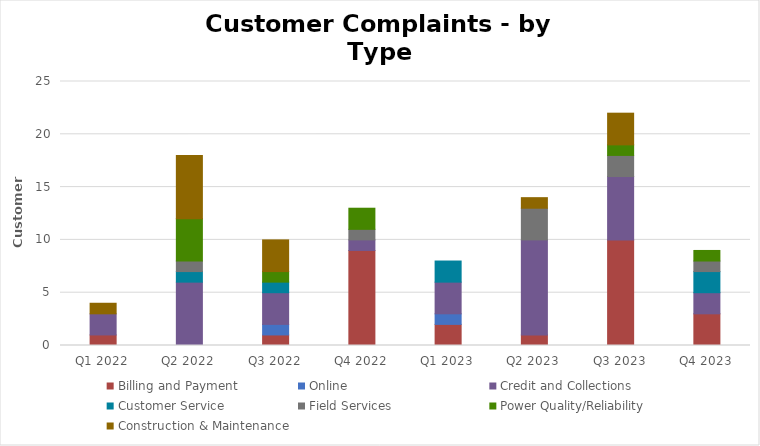
| Category | Billing and Payment | Online | Credit and Collections | Customer Service | Field Services | Power Quality/Reliability | Construction & Maintenance |
|---|---|---|---|---|---|---|---|
| Q1 2022 | 1 | 0 | 2 | 0 | 0 | 0 | 1 |
| Q2 2022 | 0 | 0 | 6 | 1 | 1 | 4 | 6 |
| Q3 2022 | 1 | 1 | 3 | 1 | 0 | 1 | 3 |
| Q4 2022 | 9 | 0 | 1 | 0 | 1 | 2 | 0 |
| Q1 2023 | 2 | 1 | 3 | 2 | 0 | 0 | 0 |
| Q2 2023 | 1 | 0 | 9 | 0 | 3 | 0 | 1 |
| Q3 2023 | 10 | 0 | 6 | 0 | 2 | 1 | 3 |
| Q4 2023 | 3 | 0 | 2 | 2 | 1 | 1 | 0 |